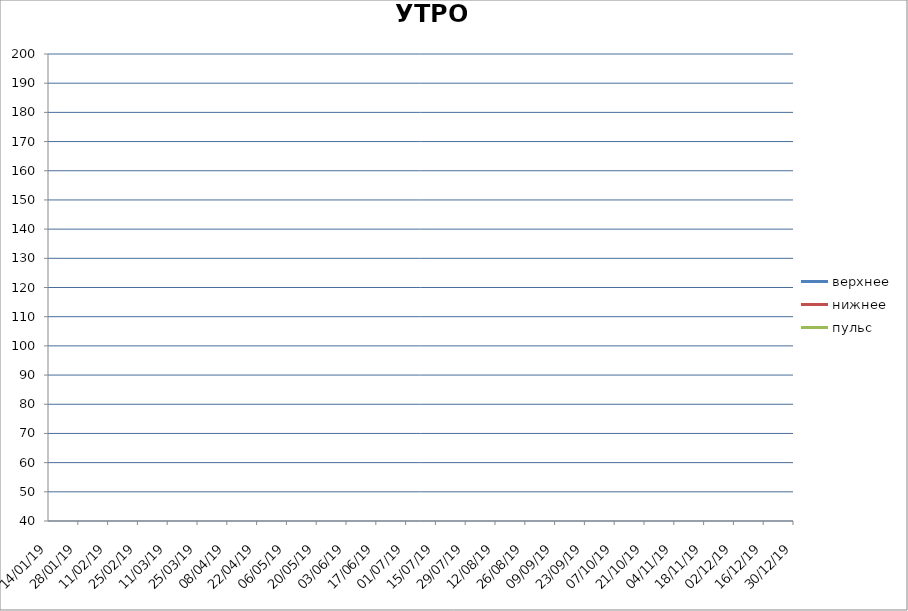
| Category | верхнее | нижнее | пульс |
|---|---|---|---|
| 2019-01-14 | 0 | 0 | 0 |
| 2019-01-28 | 0 | 0 | 0 |
| 2019-02-11 | 0 | 0 | 0 |
| 2019-02-25 | 0 | 0 | 0 |
| 2019-03-11 | 0 | 0 | 0 |
| 2019-03-25 | 0 | 0 | 0 |
| 2019-04-08 | 0 | 0 | 0 |
| 2019-04-22 | 0 | 0 | 0 |
| 2019-05-06 | 0 | 0 | 0 |
| 2019-05-20 | 0 | 0 | 0 |
| 2019-06-03 | 0 | 0 | 0 |
| 2019-06-17 | 0 | 0 | 0 |
| 2019-07-01 | 0 | 0 | 0 |
| 2019-07-15 | 0 | 0 | 0 |
| 2019-07-29 | 0 | 0 | 0 |
| 2019-08-12 | 0 | 0 | 0 |
| 2019-08-26 | 0 | 0 | 0 |
| 2019-09-09 | 0 | 0 | 0 |
| 2019-09-23 | 0 | 0 | 0 |
| 2019-10-07 | 0 | 0 | 0 |
| 2019-10-21 | 0 | 0 | 0 |
| 2019-11-04 | 0 | 0 | 0 |
| 2019-11-18 | 0 | 0 | 0 |
| 2019-12-02 | 0 | 0 | 0 |
| 2019-12-16 | 0 | 0 | 0 |
| 2019-12-30 | 0 | 0 | 0 |